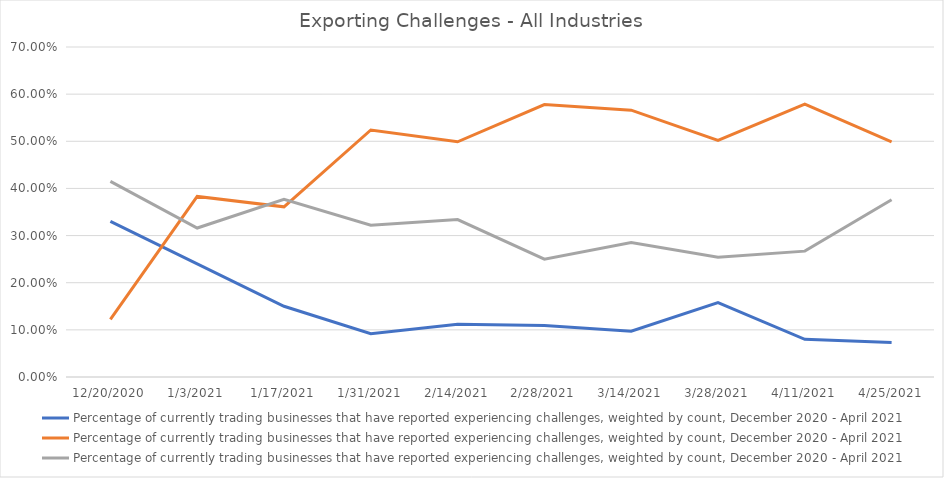
| Category | Percentage of currently trading businesses that have reported experiencing challenges, weighted by count, December 2020 - April 2021 |
|---|---|
| 12/20/20 | 0.415 |
| 1/3/21 | 0.316 |
| 1/17/21 | 0.377 |
| 1/31/21 | 0.322 |
| 2/14/21 | 0.334 |
| 2/28/21 | 0.25 |
| 3/14/21 | 0.285 |
| 3/28/21 | 0.254 |
| 4/11/21 | 0.267 |
| 4/25/21 | 0.376 |